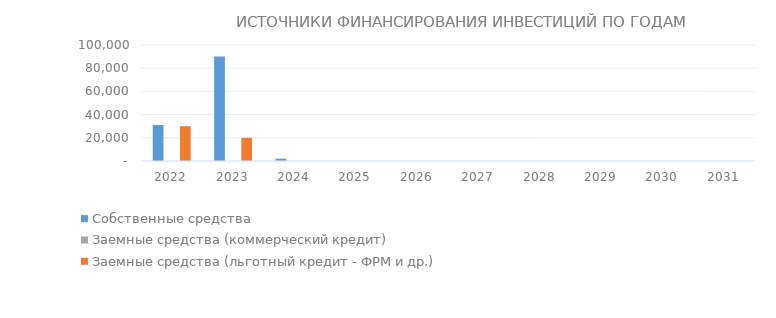
| Category | Собственные средства | Заемные средства (коммерческий кредит) | Заемные средства (льготный кредит - ФРМ и др.) |
|---|---|---|---|
| 2022.0 | 31000 | 0 | 30000 |
| 2023.0 | 90000 | 0 | 20000 |
| 2024.0 | 2000 | 0 | 0 |
| 2025.0 | 0 | 0 | 0 |
| 2026.0 | 0 | 0 | 0 |
| 2027.0 | 0 | 0 | 0 |
| 2028.0 | 0 | 0 | 0 |
| 2029.0 | 0 | 0 | 0 |
| 2030.0 | 0 | 0 | 0 |
| 2031.0 | 0 | 0 | 0 |